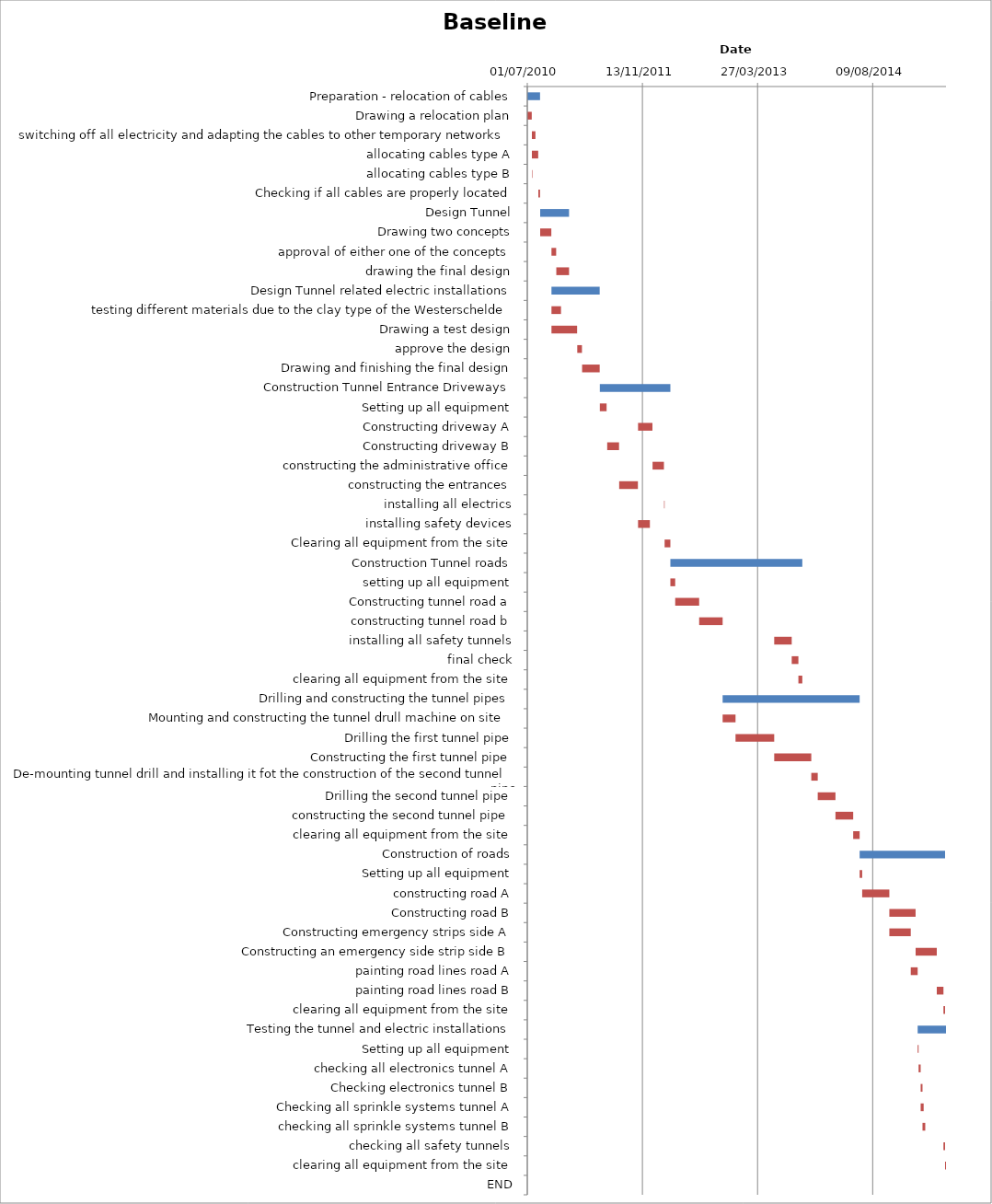
| Category | Baseline start | Actual duration |
|---|---|---|
| Preparation - relocation of cables | 40360.333 | 55.375 |
| Drawing a relocation plan | 40360.333 | 19.375 |
| switching off all electricity and adapting the cables to other temporary networks | 40380.333 | 15.375 |
| allocating cables type A | 40380.333 | 27.375 |
| allocating cables type B | 40380.333 | 2.083 |
| Checking if all cables are properly located | 40408.333 | 7.375 |
| Design Tunnel | 40416.333 | 125.375 |
| Drawing two concepts | 40416.333 | 48.375 |
| approval of either one of the concepts | 40465.333 | 20.375 |
| drawing the final design | 40486.333 | 55.375 |
| Design Tunnel related electric installations | 40465.333 | 209.375 |
| testing different materials due to the clay type of the Westerschelde | 40465.333 | 41.375 |
| Drawing a test design | 40465.333 | 111.375 |
| approve the design | 40577.333 | 20.375 |
| Drawing and finishing the final design | 40598.333 | 76.375 |
| Construction Tunnel Entrance Driveways | 40675.333 | 306.333 |
| Setting up all equipment | 40675.333 | 29.375 |
| Constructing driveway A | 40841.333 | 62.375 |
| Constructing driveway B | 40707.333 | 51.375 |
| constructing the administrative office | 40904.333 | 49.375 |
| constructing the entrances | 40759.333 | 81.375 |
| installing all electrics | 40954.333 | 2.333 |
| installing safety devices | 40841.333 | 51.375 |
| Clearing all equipment from the site | 40956.667 | 25 |
| Construction Tunnel roads | 40981.667 | 573 |
| setting up all equipment | 40981.667 | 21 |
| Constructing tunnel road a | 41002.667 | 104 |
| constructing tunnel road b | 41106.667 | 102 |
| installing all safety tunnels | 41432.667 | 76 |
| final check | 41508.667 | 29 |
| clearing all equipment from the site | 41537.667 | 17 |
| Drilling and constructing the tunnel pipes | 41208.667 | 595 |
| Mounting and constructing the tunnel drull machine on site | 41208.667 | 56 |
| Drilling the first tunnel pipe | 41264.667 | 168 |
| Constructing the first tunnel pipe | 41432.667 | 161 |
| De-mounting tunnel drill and installing it fot the construction of the second tunnel pipe | 41593.667 | 28 |
| Drilling the second tunnel pipe | 41621.667 | 77 |
| constructing the second tunnel pipe | 41698.667 | 77 |
| clearing all equipment from the site | 41775.667 | 28 |
| Construction of roads | 41803.667 | 371 |
| Setting up all equipment | 41803.667 | 11 |
| constructing road A | 41814.667 | 118 |
| Constructing road B | 41932.667 | 114 |
| Constructing emergency strips side A | 41932.667 | 93 |
| Constructing an emergency side strip side B | 42046.667 | 92 |
| painting road lines road A | 42025.667 | 30 |
| painting road lines road B | 42138.667 | 29 |
| clearing all equipment from the site | 42167.667 | 7 |
| Testing the tunnel and electric installations | 42055.667 | 123 |
| Setting up all equipment | 42055.667 | 4 |
| checking all electronics tunnel A | 42059.667 | 9 |
| Checking electronics tunnel B | 42068.667 | 8 |
| Checking all sprinkle systems tunnel A | 42068.667 | 13 |
| checking all sprinkle systems tunnel B | 42076.667 | 12 |
| checking all safety tunnels | 42167.667 | 7 |
| clearing all equipment from the site | 42174.667 | 4 |
| END | 42178.667 | 0 |